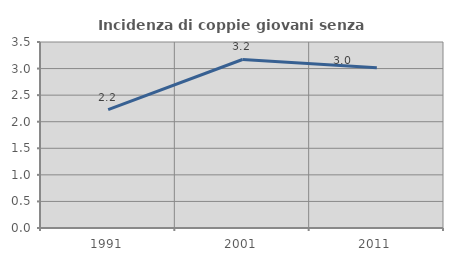
| Category | Incidenza di coppie giovani senza figli |
|---|---|
| 1991.0 | 2.228 |
| 2001.0 | 3.171 |
| 2011.0 | 3.017 |